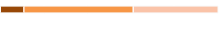
| Category | Series 0 | Series 1 | Series 2 |
|---|---|---|---|
| 0 | 0.108 | 0.502 | 0.39 |